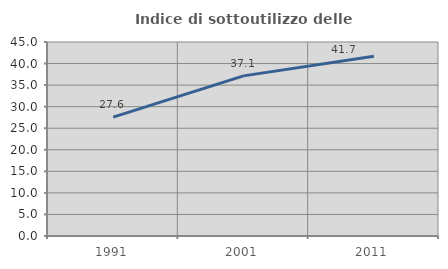
| Category | Indice di sottoutilizzo delle abitazioni  |
|---|---|
| 1991.0 | 27.561 |
| 2001.0 | 37.145 |
| 2011.0 | 41.703 |